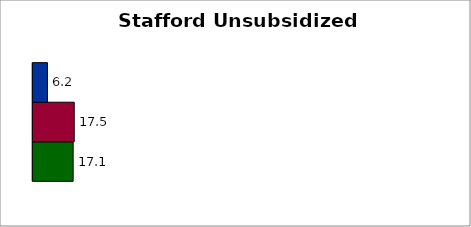
| Category | State | SREB states | 50 states and D.C. |
|---|---|---|---|
| 0 | 17.064 | 17.526 | 6.201 |